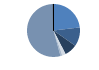
| Category | Series 0 |
|---|---|
| ARRASTRE | 332 |
| CERCO | 166 |
| PALANGRE | 111 |
| REDES DE ENMALLE | 31 |
| ARTES FIJAS | 16 |
| ARTES MENORES | 777 |
| SIN TIPO ASIGNADO | 1 |